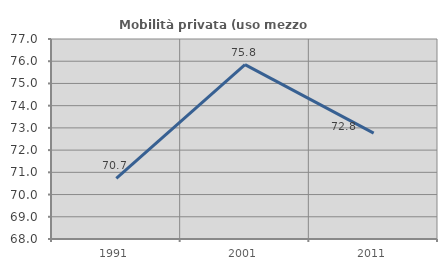
| Category | Mobilità privata (uso mezzo privato) |
|---|---|
| 1991.0 | 70.732 |
| 2001.0 | 75.845 |
| 2011.0 | 72.761 |